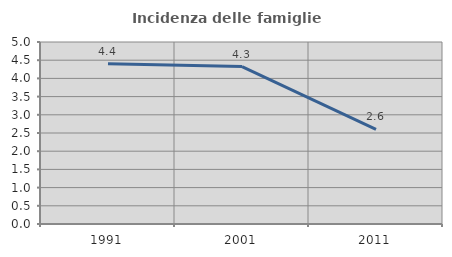
| Category | Incidenza delle famiglie numerose |
|---|---|
| 1991.0 | 4.405 |
| 2001.0 | 4.324 |
| 2011.0 | 2.601 |